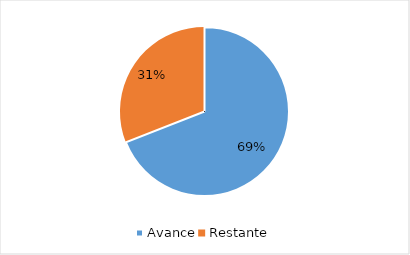
| Category | Series 0 |
|---|---|
| Avance | 0.69 |
| Restante | 0.31 |